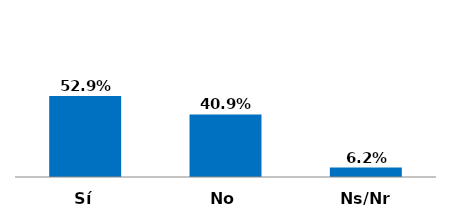
| Category | Series 0 |
|---|---|
| Sí | 0.529 |
| No | 0.409 |
| Ns/Nr | 0.062 |